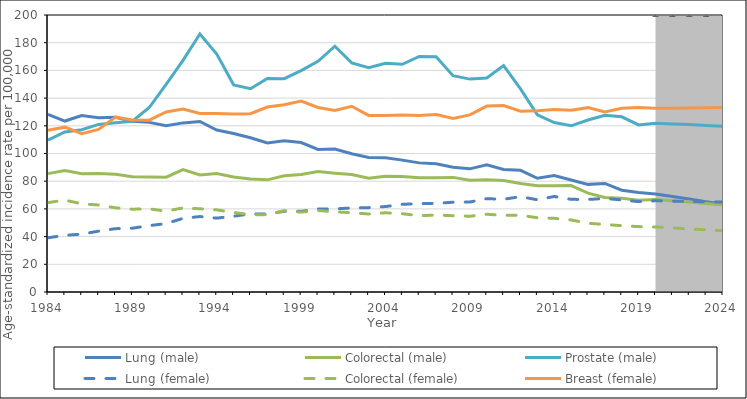
| Category | Lung (male) | Colorectal (male) | Prostate (male) | Lung (female) | Colorectal (female) | Breast (female) |
|---|---|---|---|---|---|---|
| 1984.0 | 128.303 | 85.463 | 109.721 | 39.173 | 64.524 | 116.825 |
| 1985.0 | 123.43 | 87.628 | 115.539 | 40.909 | 66.384 | 119.023 |
| 1986.0 | 127.426 | 85.39 | 117.202 | 41.794 | 63.632 | 114.281 |
| 1987.0 | 125.74 | 85.529 | 121.011 | 43.952 | 62.83 | 117.382 |
| 1988.0 | 126.123 | 85.03 | 122.24 | 45.727 | 60.793 | 126.246 |
| 1989.0 | 123.341 | 83.138 | 123.275 | 46.058 | 59.791 | 124.245 |
| 1990.0 | 122.473 | 83.012 | 133.201 | 47.924 | 60.041 | 124.049 |
| 1991.0 | 120.067 | 82.909 | 149.943 | 49.424 | 58.361 | 130.012 |
| 1992.0 | 122.108 | 88.405 | 167.198 | 53.17 | 60.719 | 132.103 |
| 1993.0 | 123.139 | 84.466 | 186.327 | 54.481 | 60.09 | 128.959 |
| 1994.0 | 116.905 | 85.514 | 171.738 | 53.333 | 59.298 | 128.829 |
| 1995.0 | 114.403 | 83.046 | 149.573 | 54.724 | 57.424 | 128.576 |
| 1996.0 | 111.357 | 81.539 | 146.814 | 56.399 | 55.773 | 128.732 |
| 1997.0 | 107.655 | 80.977 | 154.158 | 56.238 | 55.883 | 133.579 |
| 1998.0 | 109.153 | 83.98 | 154.036 | 58.297 | 58.74 | 135.178 |
| 1999.0 | 107.888 | 84.842 | 159.83 | 58.214 | 57.672 | 137.827 |
| 2000.0 | 102.896 | 86.975 | 166.592 | 59.955 | 58.823 | 133.248 |
| 2001.0 | 103.22 | 85.784 | 177.444 | 60.013 | 57.923 | 131.137 |
| 2002.0 | 99.848 | 84.765 | 165.477 | 60.661 | 57.212 | 134.078 |
| 2003.0 | 97.174 | 82.086 | 161.871 | 60.912 | 56.334 | 127.489 |
| 2004.0 | 96.923 | 83.605 | 165.193 | 61.691 | 57.2 | 127.514 |
| 2005.0 | 95.217 | 83.309 | 164.378 | 63.326 | 56.53 | 127.755 |
| 2006.0 | 93.229 | 82.438 | 170.086 | 63.768 | 55.07 | 127.489 |
| 2007.0 | 92.646 | 82.43 | 169.782 | 64 | 55.586 | 128.076 |
| 2008.0 | 90.117 | 82.746 | 156.209 | 64.824 | 55.093 | 125.361 |
| 2009.0 | 88.912 | 80.645 | 153.711 | 64.984 | 54.703 | 127.904 |
| 2010.0 | 91.796 | 81.097 | 154.477 | 67.403 | 56.142 | 134.237 |
| 2011.0 | 88.441 | 80.52 | 163.495 | 66.956 | 55.359 | 134.571 |
| 2012.0 | 87.84 | 78.325 | 146.653 | 68.863 | 55.379 | 130.509 |
| 2013.0 | 82.105 | 76.709 | 127.921 | 66.595 | 53.626 | 130.879 |
| 2014.0 | 84.032 | 76.646 | 122.358 | 68.982 | 53.197 | 131.75 |
| 2015.0 | 80.836 | 76.846 | 119.991 | 66.905 | 52.011 | 131.312 |
| 2016.0 | 77.714 | 71.42 | 124.151 | 66.8 | 49.641 | 133.106 |
| 2017.0 | 78.375 | 68.194 | 127.575 | 67.557 | 48.77 | 129.957 |
| 2018.0 | 73.481 | 67.619 | 126.511 | 66.479 | 47.867 | 132.597 |
| 2019.0 | 71.869 | 66.274 | 120.617 | 65.238 | 47.214 | 133.269 |
| 2020.0 | 70.74 | 66.869 | 121.922 | 65.879 | 46.947 | 132.613 |
| 2021.0 | 68.938 | 65.873 | 121.345 | 65.606 | 46.277 | 132.753 |
| 2022.0 | 67.139 | 64.919 | 120.865 | 65.4 | 45.584 | 132.874 |
| 2023.0 | 65.256 | 63.937 | 120.287 | 65.134 | 44.9 | 132.999 |
| 2024.0 | 63.444 | 62.956 | 119.723 | 64.895 | 44.247 | 133.137 |